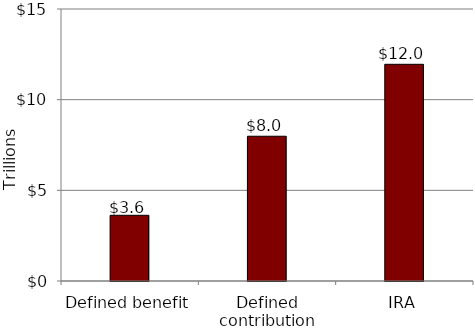
| Category | Series 0 |
|---|---|
| Defined benefit | 3.623 |
| Defined contribution | 7.983 |
| IRA | 11.95 |